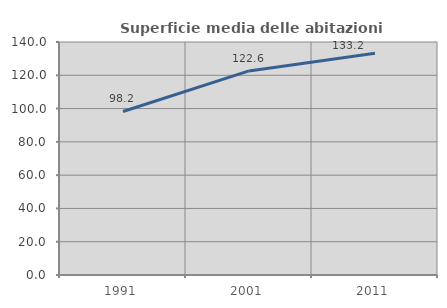
| Category | Superficie media delle abitazioni occupate |
|---|---|
| 1991.0 | 98.247 |
| 2001.0 | 122.625 |
| 2011.0 | 133.229 |